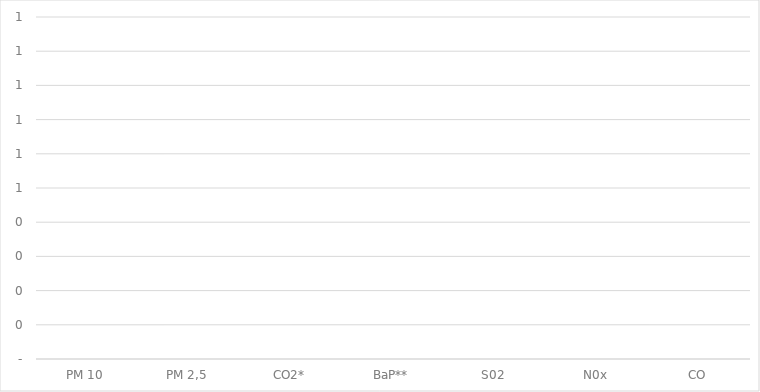
| Category | Series 0 |
|---|---|
| PM 10 | 0 |
| PM 2,5 | 0 |
| CO2* | 0 |
| BaP** | 0 |
| S02 | 0 |
| N0x | 0 |
| CO | 0 |